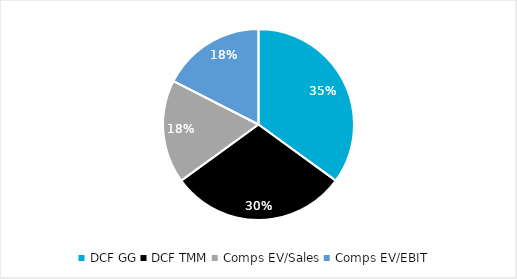
| Category | Series 0 |
|---|---|
| DCF GG | 0.35 |
| DCF TMM | 0.3 |
| Comps EV/Sales | 0.175 |
| Comps EV/EBIT | 0.175 |